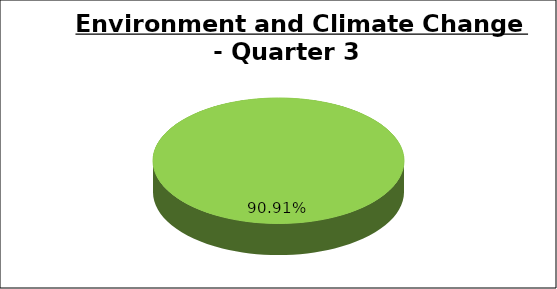
| Category | Green | Amber | Red |
|---|---|---|---|
| Q3 | 0.909 | 0.061 | 0.03 |